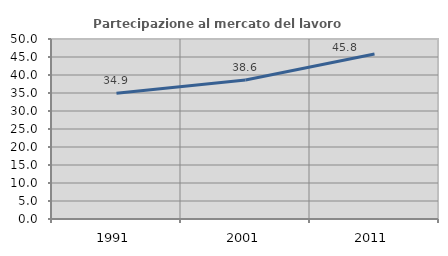
| Category | Partecipazione al mercato del lavoro  femminile |
|---|---|
| 1991.0 | 34.934 |
| 2001.0 | 38.601 |
| 2011.0 | 45.831 |